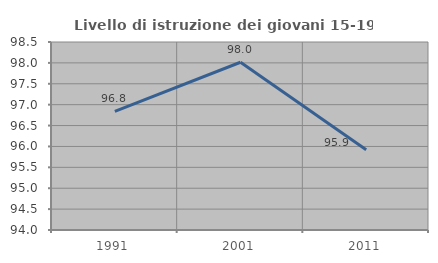
| Category | Livello di istruzione dei giovani 15-19 anni |
|---|---|
| 1991.0 | 96.84 |
| 2001.0 | 98.015 |
| 2011.0 | 95.923 |